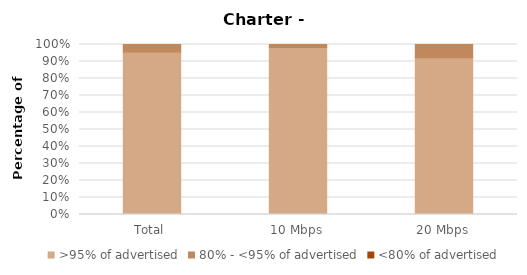
| Category | >95% of advertised | 80% - <95% of advertised | <80% of advertised |
|---|---|---|---|
| Total | 0.956 | 0.044 | 0 |
| 10 Mbps | 0.982 | 0.018 | 0 |
| 20 Mbps | 0.921 | 0.079 | 0 |